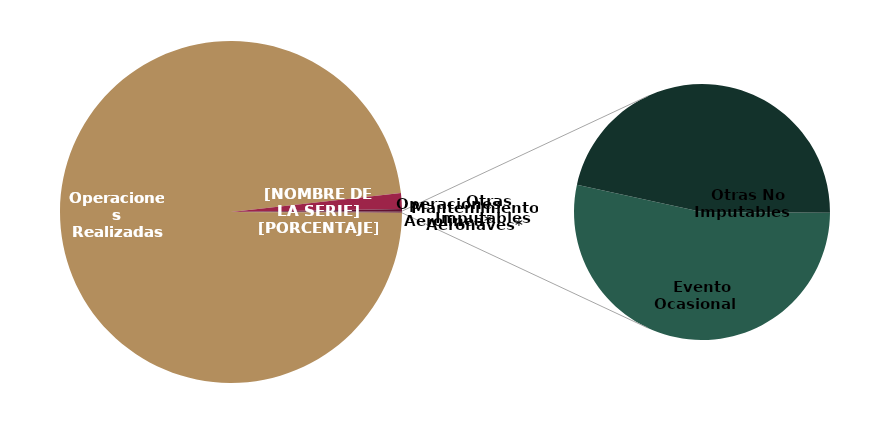
| Category | Cancelaciones |
|---|---|
| Operaciones Realizadas | 9203 |
|    Operaciones Aerolinea* | 140 |
|    Mantenimiento Aeronaves* | 18 |
|    Otras Imputables | 1 |
|    Evento Ocasional | 8 |
|    Otras No Imputables | 7 |